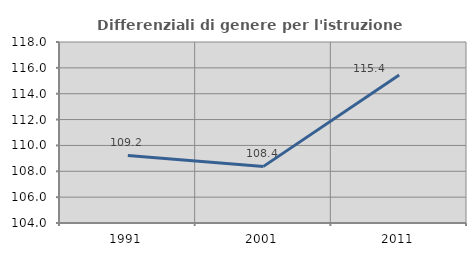
| Category | Differenziali di genere per l'istruzione superiore |
|---|---|
| 1991.0 | 109.23 |
| 2001.0 | 108.379 |
| 2011.0 | 115.44 |